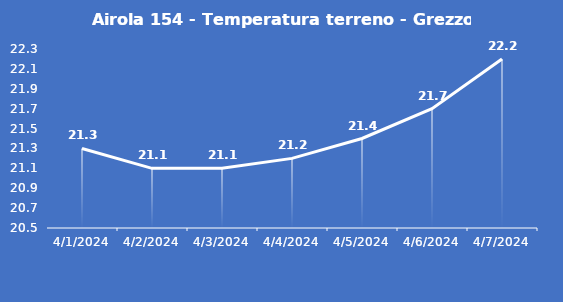
| Category | Airola 154 - Temperatura terreno - Grezzo (°C) |
|---|---|
| 4/1/24 | 21.3 |
| 4/2/24 | 21.1 |
| 4/3/24 | 21.1 |
| 4/4/24 | 21.2 |
| 4/5/24 | 21.4 |
| 4/6/24 | 21.7 |
| 4/7/24 | 22.2 |